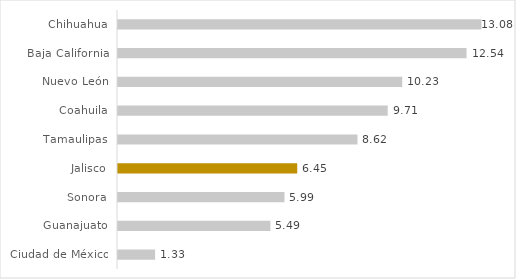
| Category | Series 0 |
|---|---|
| Ciudad de México | 1.335 |
| Guanajuato | 5.485 |
| Sonora | 5.99 |
| Jalisco | 6.45 |
| Tamaulipas | 8.619 |
| Coahuila | 9.707 |
| Nuevo León | 10.229 |
| Baja California | 12.544 |
| Chihuahua | 13.08 |